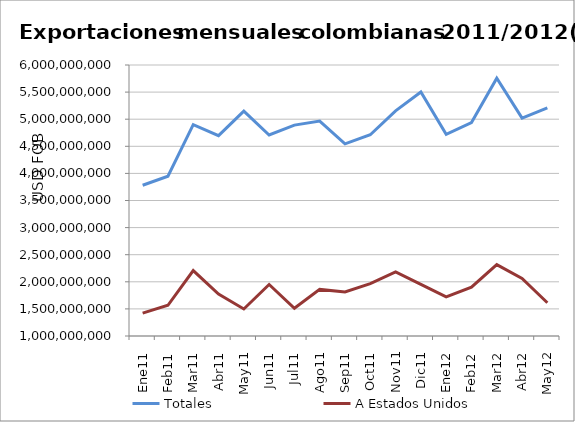
| Category | Totales | A Estados Unidos |
|---|---|---|
| 0 | 3782047613.9 | 1422869192.52 |
| 1 | 3947644928.88 | 1566744360.17 |
| 2 | 4899397400.13 | 2207767535.79 |
| 3 | 4697319009.08 | 1773118545.67 |
| 4 | 5148592306.78 | 1498229855.71 |
| 5 | 4709093356.51 | 1950773026.17 |
| 6 | 4890392906.7 | 1511522523.59 |
| 7 | 4965178764.23 | 1859923312.34 |
| 8 | 4544204588.05 | 1811093819.32 |
| 9 | 4713453271.06 | 1967245618.76 |
| 10 | 5154809626.32 | 2182797771.81 |
| 11 | 5501382314.14 | 1953129121.89 |
| 12 | 4722309370.53 | 1721406747.83 |
| 13 | 4938252871.95 | 1900796801.76 |
| 14 | 5757516067.15 | 2318081643.6 |
| 15 | 5019792406.9 | 2062814784.57 |
| 16 | 5208237853.15 | 1613706204.53 |